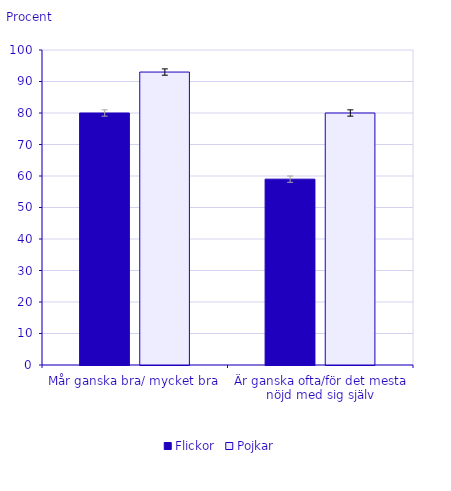
| Category | Flickor | Pojkar |
|---|---|---|
| Mår ganska bra/ mycket bra | 80 | 93 |
| Är ganska ofta/för det mesta nöjd med sig själv | 59 | 80 |